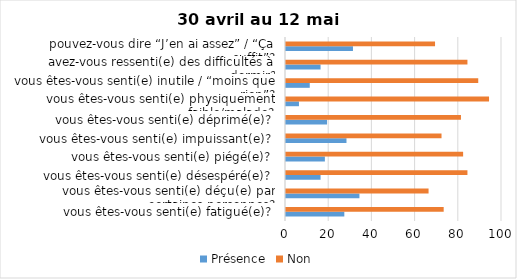
| Category | Présence | Non |
|---|---|---|
| vous êtes-vous senti(e) fatigué(e)? | 27 | 73 |
| vous êtes-vous senti(e) déçu(e) par certaines personnes? | 34 | 66 |
| vous êtes-vous senti(e) désespéré(e)? | 16 | 84 |
| vous êtes-vous senti(e) piégé(e)? | 18 | 82 |
| vous êtes-vous senti(e) impuissant(e)? | 28 | 72 |
| vous êtes-vous senti(e) déprimé(e)? | 19 | 81 |
| vous êtes-vous senti(e) physiquement faible/malade? | 6 | 94 |
| vous êtes-vous senti(e) inutile / “moins que rien”? | 11 | 89 |
| avez-vous ressenti(e) des difficultés à dormir? | 16 | 84 |
| pouvez-vous dire “J’en ai assez” / “Ça suffit”? | 31 | 69 |